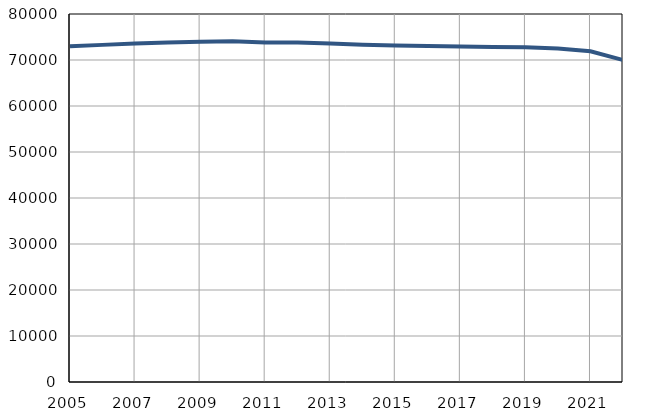
| Category | Број
становника |
|---|---|
| 2005.0 | 72996 |
| 2006.0 | 73288 |
| 2007.0 | 73610 |
| 2008.0 | 73831 |
| 2009.0 | 73951 |
| 2010.0 | 74054 |
| 2011.0 | 73825 |
| 2012.0 | 73791 |
| 2013.0 | 73584 |
| 2014.0 | 73317 |
| 2015.0 | 73140 |
| 2016.0 | 73049 |
| 2017.0 | 72942 |
| 2018.0 | 72843 |
| 2019.0 | 72750 |
| 2020.0 | 72480 |
| 2021.0 | 71910 |
| 2022.0 | 69985 |